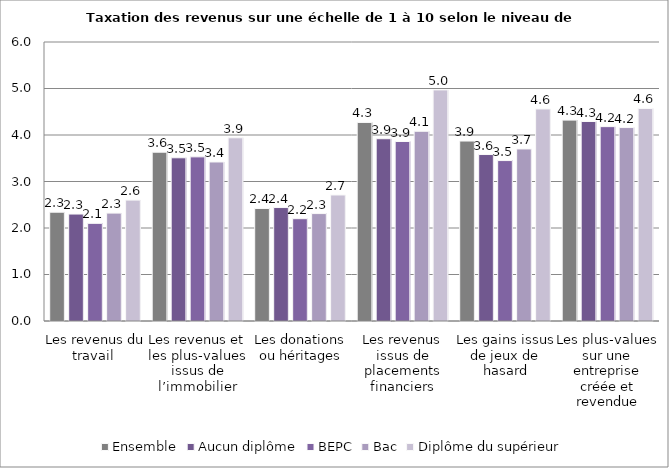
| Category | Ensemble | Aucun diplôme | BEPC | Bac | Diplôme du supérieur |
|---|---|---|---|---|---|
| Les revenus du travail  | 2.34 | 2.3 | 2.1 | 2.32 | 2.6 |
| Les revenus et les plus-values issus de l’immobilier | 3.63 | 3.51 | 3.53 | 3.42 | 3.94 |
| Les donations ou héritages | 2.42 | 2.44 | 2.2 | 2.31 | 2.71 |
| Les revenus issus de placements financiers | 4.27 | 3.92 | 3.86 | 4.08 | 4.97 |
| Les gains issus de jeux de hasard | 3.87 | 3.58 | 3.45 | 3.7 | 4.56 |
| Les plus-values sur une entreprise créée et revendue | 4.32 | 4.29 | 4.18 | 4.16 | 4.57 |